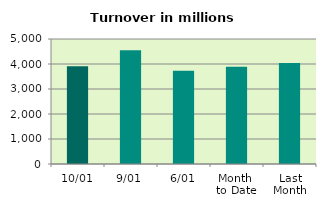
| Category | Series 0 |
|---|---|
| 10/01 | 3914.395 |
| 9/01 | 4553.279 |
| 6/01 | 3733.533 |
| Month 
to Date | 3892.763 |
| Last
Month | 4039.067 |